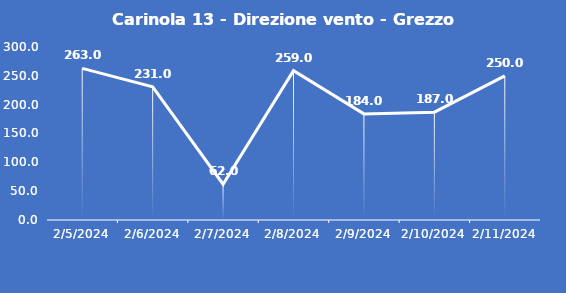
| Category | Carinola 13 - Direzione vento - Grezzo (°N) |
|---|---|
| 2/5/24 | 263 |
| 2/6/24 | 231 |
| 2/7/24 | 62 |
| 2/8/24 | 259 |
| 2/9/24 | 184 |
| 2/10/24 | 187 |
| 2/11/24 | 250 |